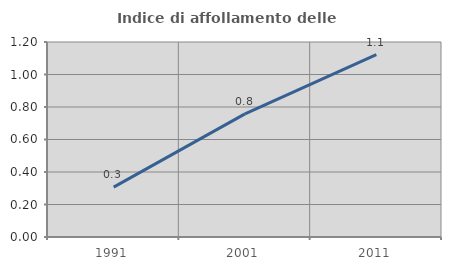
| Category | Indice di affollamento delle abitazioni  |
|---|---|
| 1991.0 | 0.307 |
| 2001.0 | 0.758 |
| 2011.0 | 1.122 |